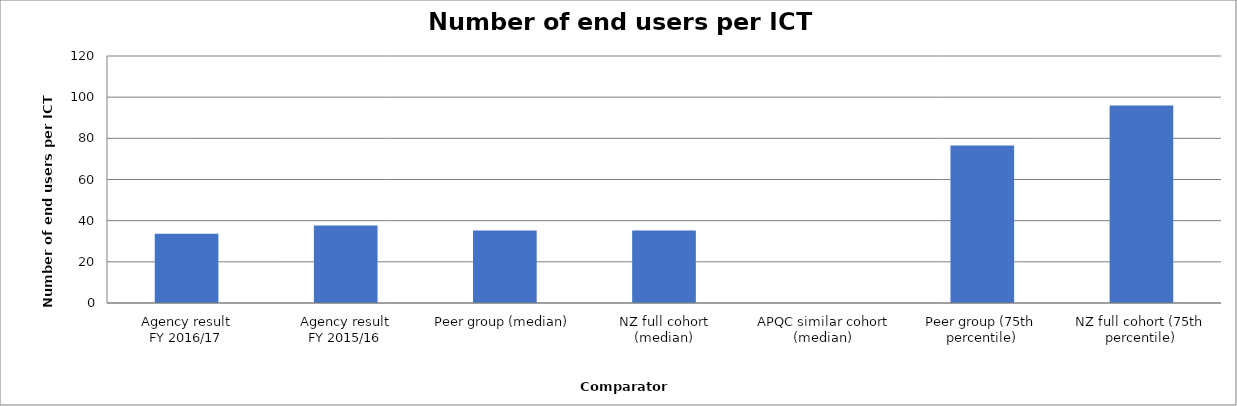
| Category | Result |
|---|---|
| Agency result
FY 2016/17 | 33.682 |
| Agency result
FY 2015/16 | 37.695 |
| Peer group (median) | 35.281 |
| NZ full cohort (median) | 35.281 |
| APQC similar cohort (median) | 0 |
| Peer group (75th percentile) | 76.571 |
| NZ full cohort (75th percentile) | 95.989 |